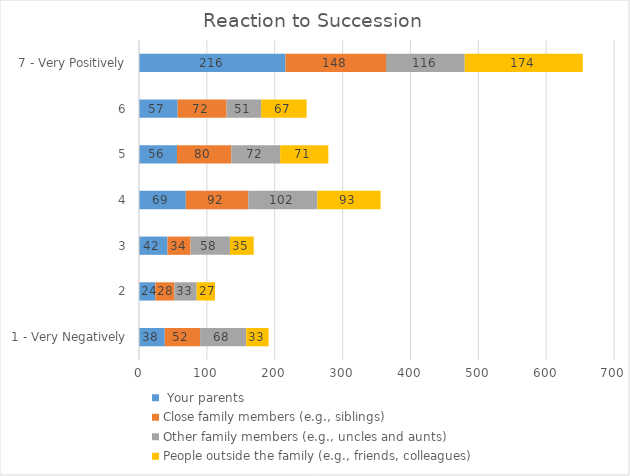
| Category |  Your parents | Close family members (e.g., siblings) | Other family members (e.g., uncles and aunts) | People outside the family (e.g., friends, colleagues) |
|---|---|---|---|---|
| 1 - Very Negatively | 38 | 52 | 68 | 33 |
| 2 | 24 | 28 | 33 | 27 |
| 3 | 42 | 34 | 58 | 35 |
| 4 | 69 | 92 | 102 | 93 |
| 5 | 56 | 80 | 72 | 71 |
| 6 | 57 | 72 | 51 | 67 |
| 7 - Very Positively | 216 | 148 | 116 | 174 |